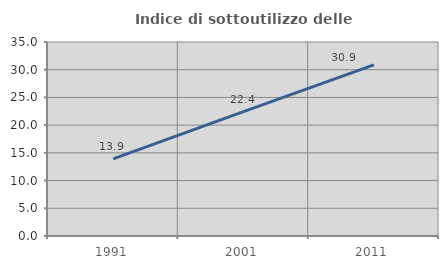
| Category | Indice di sottoutilizzo delle abitazioni  |
|---|---|
| 1991.0 | 13.912 |
| 2001.0 | 22.443 |
| 2011.0 | 30.887 |